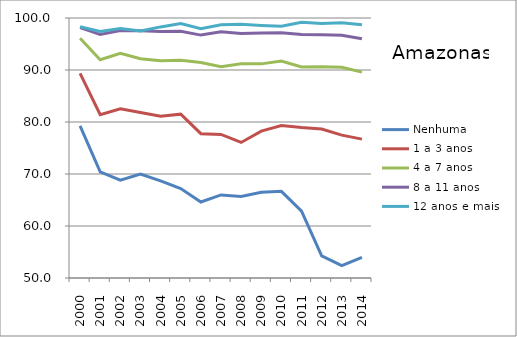
| Category | Nenhuma | 1 a 3 anos | 4 a 7 anos | 8 a 11 anos | 12 anos e mais |
|---|---|---|---|---|---|
| 2000.0 | 79.245 | 89.366 | 96.109 | 98.146 | 98.305 |
| 2001.0 | 70.395 | 81.419 | 91.984 | 96.816 | 97.409 |
| 2002.0 | 68.807 | 82.539 | 93.209 | 97.576 | 97.955 |
| 2003.0 | 69.994 | 81.832 | 92.157 | 97.565 | 97.511 |
| 2004.0 | 68.688 | 81.105 | 91.758 | 97.42 | 98.288 |
| 2005.0 | 67.216 | 81.512 | 91.881 | 97.433 | 98.941 |
| 2006.0 | 64.621 | 77.758 | 91.425 | 96.712 | 97.95 |
| 2007.0 | 65.975 | 77.609 | 90.651 | 97.346 | 98.708 |
| 2008.0 | 65.676 | 76.068 | 91.181 | 97.016 | 98.795 |
| 2009.0 | 66.486 | 78.249 | 91.178 | 97.133 | 98.581 |
| 2010.0 | 66.667 | 79.318 | 91.74 | 97.168 | 98.436 |
| 2011.0 | 62.856 | 78.92 | 90.583 | 96.843 | 99.165 |
| 2012.0 | 54.259 | 78.665 | 90.645 | 96.789 | 98.934 |
| 2013.0 | 52.371 | 77.474 | 90.523 | 96.696 | 99.106 |
| 2014.0 | 53.964 | 76.709 | 89.59 | 96.001 | 98.703 |